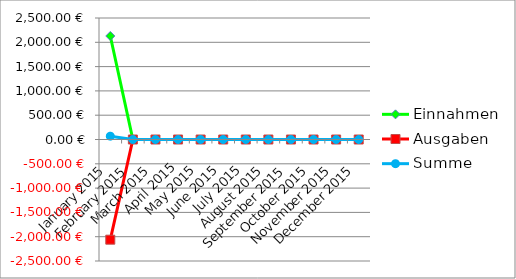
| Category | Einnahmen | Ausgaben | Summe |
|---|---|---|---|
| 2015-01-01 | 2129.86 | -2061.41 | 68.45 |
| 2015-02-01 | 0 | 0 | 0 |
| 2015-03-01 | 0 | 0 | 0 |
| 2015-04-01 | 0 | 0 | 0 |
| 2015-05-01 | 0 | 0 | 0 |
| 2015-06-01 | 0 | 0 | 0 |
| 2015-07-01 | 0 | 0 | 0 |
| 2015-08-01 | 0 | 0 | 0 |
| 2015-09-01 | 0 | 0 | 0 |
| 2015-10-01 | 0 | 0 | 0 |
| 2015-11-01 | 0 | 0 | 0 |
| 2015-12-01 | 0 | 0 | 0 |